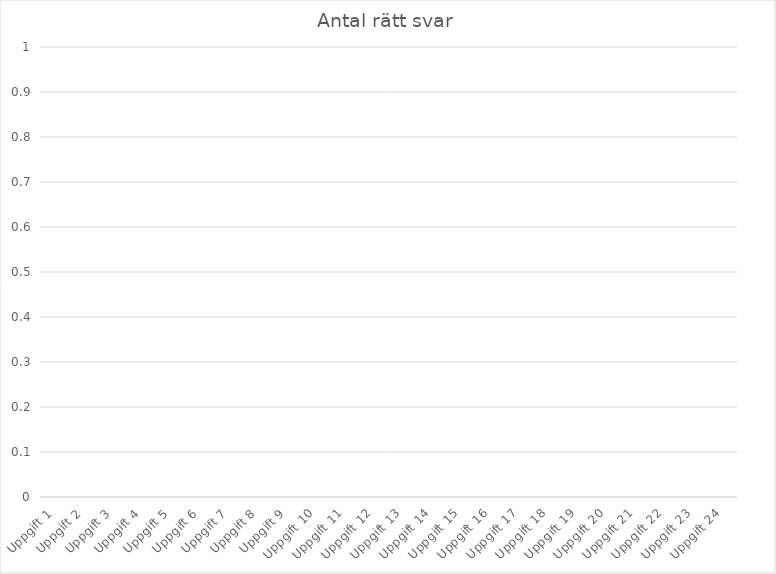
| Category | Antal elever rätt svar |
|---|---|
| Uppgift 1 | 0 |
| Uppgift 2 | 0 |
| Uppgift 3 | 0 |
| Uppgift 4 | 0 |
| Uppgift 5 | 0 |
| Uppgift 6 | 0 |
| Uppgift 7 | 0 |
| Uppgift 8 | 0 |
| Uppgift 9 | 0 |
| Uppgift 10 | 0 |
| Uppgift 11 | 0 |
| Uppgift 12 | 0 |
| Uppgift 13 | 0 |
| Uppgift 14 | 0 |
| Uppgift 15 | 0 |
| Uppgift 16 | 0 |
| Uppgift 17 | 0 |
| Uppgift 18 | 0 |
| Uppgift 19 | 0 |
| Uppgift 20 | 0 |
| Uppgift 21 | 0 |
| Uppgift 22 | 0 |
| Uppgift 23 | 0 |
| Uppgift 24 | 0 |